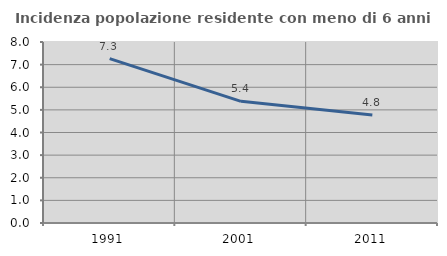
| Category | Incidenza popolazione residente con meno di 6 anni |
|---|---|
| 1991.0 | 7.268 |
| 2001.0 | 5.377 |
| 2011.0 | 4.772 |